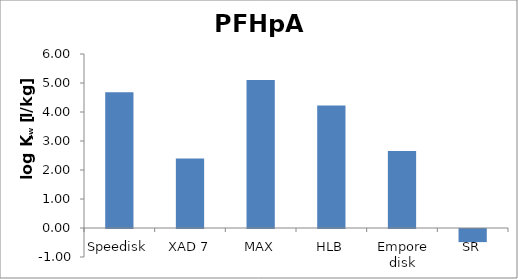
| Category | PFHpA  |
|---|---|
| Speedisk | 4.677 |
| XAD 7 | 2.395 |
| MAX | 5.103 |
| HLB | 4.222 |
| Empore disk | 2.655 |
| SR | -0.452 |